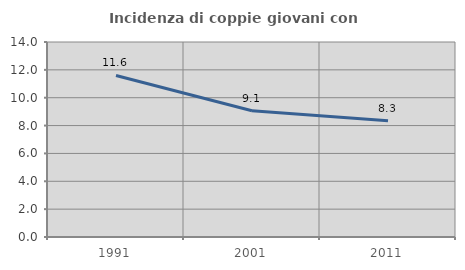
| Category | Incidenza di coppie giovani con figli |
|---|---|
| 1991.0 | 11.597 |
| 2001.0 | 9.062 |
| 2011.0 | 8.345 |